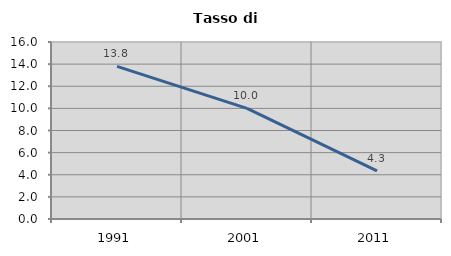
| Category | Tasso di disoccupazione   |
|---|---|
| 1991.0 | 13.793 |
| 2001.0 | 10 |
| 2011.0 | 4.348 |